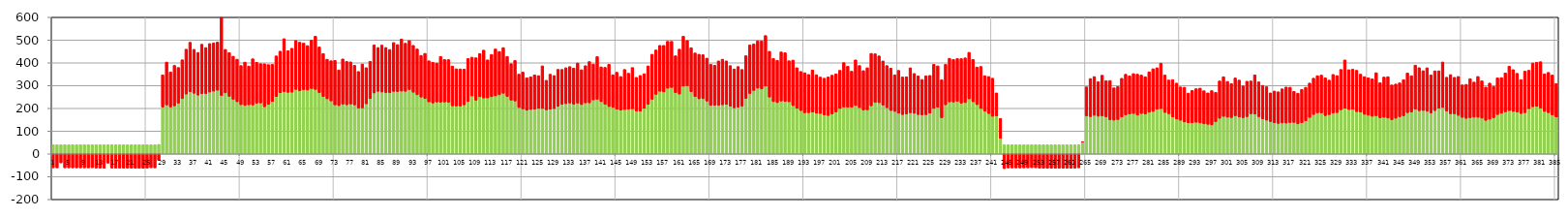
| Category | Технич потери | Коммерч |
|---|---|---|
| 0 | 40.177 | -61.424 |
| 1 | 40.177 | -61.596 |
| 2 | 40.177 | -39.695 |
| 3 | 40.177 | -61.449 |
| 4 | 40.177 | -61.481 |
| 5 | 40.177 | -61.507 |
| 6 | 40.177 | -61.566 |
| 7 | 40.177 | -61.611 |
| 8 | 40.177 | -61.558 |
| 9 | 40.177 | -61.572 |
| 10 | 40.177 | -60.806 |
| 11 | 40.177 | -62.215 |
| 12 | 40.177 | -62.842 |
| 13 | 40.177 | -62.888 |
| 14 | 40.177 | -40.828 |
| 15 | 40.177 | -62.418 |
| 16 | 40.177 | -62.504 |
| 17 | 40.177 | -62.665 |
| 18 | 40.177 | -62.781 |
| 19 | 40.177 | -62.767 |
| 20 | 40.177 | -62.87 |
| 21 | 40.177 | -63.203 |
| 22 | 40.177 | -63.323 |
| 23 | 40.177 | -63.776 |
| 24 | 40.177 | -62.591 |
| 25 | 40.177 | -60.986 |
| 26 | 40.177 | -61.434 |
| 27 | 41.552 | -28.352 |
| 28 | 205.271 | 141.677 |
| 29 | 214.719 | 188.447 |
| 30 | 205.045 | 154.985 |
| 31 | 210.693 | 177.776 |
| 32 | 222.275 | 157.188 |
| 33 | 243.038 | 170.319 |
| 34 | 262.456 | 197.323 |
| 35 | 272.575 | 217.698 |
| 36 | 266.02 | 193.243 |
| 37 | 257.903 | 187.428 |
| 38 | 264.232 | 217.415 |
| 39 | 264.53 | 202.36 |
| 40 | 271.336 | 213.285 |
| 41 | 275.358 | 212.043 |
| 42 | 279.392 | 211.878 |
| 43 | 256 | 1385.104 |
| 44 | 267.815 | 191.111 |
| 45 | 252.258 | 192.517 |
| 46 | 239.373 | 189.653 |
| 47 | 228.878 | 186.964 |
| 48 | 215.773 | 172.306 |
| 49 | 212.376 | 190.737 |
| 50 | 215.419 | 170.46 |
| 51 | 214.462 | 203.112 |
| 52 | 222.265 | 179.75 |
| 53 | 223.573 | 172.697 |
| 54 | 206.714 | 189.149 |
| 55 | 217.274 | 174.996 |
| 56 | 229.707 | 163.429 |
| 57 | 251.248 | 179.028 |
| 58 | 267.973 | 183.183 |
| 59 | 273.609 | 232.433 |
| 60 | 270.181 | 182.782 |
| 61 | 270.86 | 192.982 |
| 62 | 282.936 | 215.137 |
| 63 | 276.658 | 213.985 |
| 64 | 281.792 | 204.754 |
| 65 | 280.18 | 195.366 |
| 66 | 286.616 | 213.074 |
| 67 | 283.008 | 233.614 |
| 68 | 268.497 | 200.934 |
| 69 | 251.042 | 189.702 |
| 70 | 241.726 | 174.047 |
| 71 | 232.281 | 176.713 |
| 72 | 214.983 | 195.329 |
| 73 | 211.816 | 156.99 |
| 74 | 218.016 | 198.932 |
| 75 | 215.452 | 190.596 |
| 76 | 218.644 | 185.387 |
| 77 | 214.971 | 174.056 |
| 78 | 201.227 | 160.627 |
| 79 | 201.793 | 192.993 |
| 80 | 219.896 | 158.763 |
| 81 | 242.322 | 164.351 |
| 82 | 267.417 | 211.035 |
| 83 | 274.411 | 192.778 |
| 84 | 271.477 | 206.24 |
| 85 | 268.991 | 198.238 |
| 86 | 268.272 | 190.217 |
| 87 | 273.958 | 215.162 |
| 88 | 273.236 | 206.927 |
| 89 | 275.46 | 228.994 |
| 90 | 274.478 | 211.464 |
| 91 | 282.021 | 215.6 |
| 92 | 270.597 | 206.038 |
| 93 | 259.353 | 201.25 |
| 94 | 249.055 | 183.387 |
| 95 | 242.499 | 198.966 |
| 96 | 228.193 | 180.696 |
| 97 | 223.059 | 179.414 |
| 98 | 227.565 | 171.277 |
| 99 | 226.623 | 201.308 |
| 100 | 227.682 | 186.847 |
| 101 | 226.471 | 187.719 |
| 102 | 210.742 | 174.975 |
| 103 | 210.181 | 163.413 |
| 104 | 210.19 | 162.907 |
| 105 | 215.269 | 157.026 |
| 106 | 230.457 | 188.366 |
| 107 | 254.387 | 170.287 |
| 108 | 235.335 | 186.93 |
| 109 | 250.616 | 189.9 |
| 110 | 245.189 | 210.485 |
| 111 | 245.589 | 167.399 |
| 112 | 250.691 | 186.013 |
| 113 | 254.545 | 206.11 |
| 114 | 259.124 | 190.919 |
| 115 | 265.871 | 200.755 |
| 116 | 251.722 | 176.338 |
| 117 | 235.41 | 160.858 |
| 118 | 231.848 | 178.332 |
| 119 | 203.318 | 146.734 |
| 120 | 197.529 | 161.76 |
| 121 | 191.318 | 142.98 |
| 122 | 194.916 | 143.569 |
| 123 | 195.885 | 150.868 |
| 124 | 199.659 | 144.077 |
| 125 | 199.302 | 187.402 |
| 126 | 193.33 | 129.938 |
| 127 | 196.203 | 153.682 |
| 128 | 198.904 | 145.239 |
| 129 | 208.293 | 162.984 |
| 130 | 217.26 | 153.772 |
| 131 | 220.297 | 158.209 |
| 132 | 223.004 | 160.48 |
| 133 | 217.948 | 158.749 |
| 134 | 222.718 | 176.424 |
| 135 | 216.497 | 153.111 |
| 136 | 223.734 | 163.758 |
| 137 | 223.808 | 181.627 |
| 138 | 236.686 | 157.965 |
| 139 | 239.41 | 187.684 |
| 140 | 229.096 | 153 |
| 141 | 217.101 | 162.78 |
| 142 | 207.521 | 185.976 |
| 143 | 203.74 | 143.782 |
| 144 | 196.059 | 162.334 |
| 145 | 191.955 | 147.921 |
| 146 | 194.743 | 176.038 |
| 147 | 196.501 | 157.651 |
| 148 | 197.936 | 181.266 |
| 149 | 188.025 | 148.104 |
| 150 | 187.526 | 157.063 |
| 151 | 199.892 | 152.186 |
| 152 | 217.379 | 169 |
| 153 | 239.629 | 197.954 |
| 154 | 261.201 | 195.06 |
| 155 | 274.672 | 201.9 |
| 156 | 271.952 | 204.642 |
| 157 | 288.127 | 206.317 |
| 158 | 291.414 | 202.869 |
| 159 | 268.385 | 162.55 |
| 160 | 262.452 | 197.494 |
| 161 | 297.085 | 219.561 |
| 162 | 298.922 | 198.964 |
| 163 | 272.619 | 193.546 |
| 164 | 251.425 | 191.776 |
| 165 | 241.728 | 195.924 |
| 166 | 242.189 | 193.437 |
| 167 | 231.651 | 189.054 |
| 168 | 212.938 | 180.449 |
| 169 | 213.009 | 176.369 |
| 170 | 213.454 | 194.861 |
| 171 | 215.669 | 200.206 |
| 172 | 216.983 | 191.477 |
| 173 | 209.16 | 178.609 |
| 174 | 202.17 | 170.634 |
| 175 | 204.638 | 178.903 |
| 176 | 209.456 | 161.415 |
| 177 | 243.118 | 188.083 |
| 178 | 264.739 | 213.809 |
| 179 | 278.194 | 204.525 |
| 180 | 288.552 | 207.909 |
| 181 | 284.839 | 210.867 |
| 182 | 297.494 | 222.246 |
| 183 | 249.131 | 201.423 |
| 184 | 229.225 | 189.896 |
| 185 | 224.918 | 185.833 |
| 186 | 231.97 | 215.651 |
| 187 | 229.986 | 214.144 |
| 188 | 228.597 | 180.453 |
| 189 | 211.831 | 200.148 |
| 190 | 199.817 | 178.675 |
| 191 | 190.132 | 171.868 |
| 192 | 180.229 | 176.005 |
| 193 | 180.698 | 168.17 |
| 194 | 183.208 | 185.235 |
| 195 | 178.266 | 169.486 |
| 196 | 177.389 | 159.845 |
| 197 | 170.606 | 161.752 |
| 198 | 168.502 | 169.189 |
| 199 | 175.181 | 170.493 |
| 200 | 183.484 | 167.891 |
| 201 | 199.262 | 167.8 |
| 202 | 205.481 | 195.34 |
| 203 | 204.235 | 180.594 |
| 204 | 204.608 | 158.654 |
| 205 | 212.205 | 200.571 |
| 206 | 202.663 | 185.424 |
| 207 | 192.257 | 173.458 |
| 208 | 192.781 | 185.444 |
| 209 | 210.923 | 230.48 |
| 210 | 225.598 | 214.072 |
| 211 | 224.559 | 205.8 |
| 212 | 213.847 | 194.303 |
| 213 | 202.666 | 185.257 |
| 214 | 190.257 | 186.178 |
| 215 | 186.406 | 160.742 |
| 216 | 178.314 | 188.452 |
| 217 | 172.563 | 165.162 |
| 218 | 175.291 | 163.347 |
| 219 | 180.234 | 197.731 |
| 220 | 178.181 | 174.947 |
| 221 | 172.492 | 169.777 |
| 222 | 170.692 | 156.109 |
| 223 | 171.8 | 171.195 |
| 224 | 178.664 | 165.993 |
| 225 | 199.559 | 194.056 |
| 226 | 204.207 | 182.287 |
| 227 | 158.486 | 166.728 |
| 228 | 215.681 | 177.567 |
| 229 | 227.993 | 191.715 |
| 230 | 227.276 | 187.257 |
| 231 | 230.462 | 188.095 |
| 232 | 222.368 | 196.009 |
| 233 | 225.121 | 196.555 |
| 234 | 241.569 | 204.41 |
| 235 | 228.899 | 185.808 |
| 236 | 216.29 | 164.874 |
| 237 | 199.35 | 184.575 |
| 238 | 187.544 | 155.931 |
| 239 | 177.001 | 162.844 |
| 240 | 164.916 | 167.371 |
| 241 | 166.889 | 100.749 |
| 242 | 68.636 | 87.201 |
| 243 | 40.177 | -64.793 |
| 244 | 40.177 | -61.876 |
| 245 | 40.177 | -61.937 |
| 246 | 40.177 | -61.965 |
| 247 | 40.177 | -62.007 |
| 248 | 40.177 | -61.83 |
| 249 | 40.177 | -61.488 |
| 250 | 40.177 | -60.71 |
| 251 | 40.177 | -61.076 |
| 252 | 40.177 | -62.853 |
| 253 | 40.177 | -63.239 |
| 254 | 40.177 | -63.45 |
| 255 | 40.177 | -63.263 |
| 256 | 40.177 | -63.313 |
| 257 | 40.177 | -63.298 |
| 258 | 40.177 | -63.275 |
| 259 | 40.177 | -63.238 |
| 260 | 40.177 | -63.483 |
| 261 | 40.177 | -62.879 |
| 262 | 40.177 | -61.276 |
| 263 | 51.686 | 1.413 |
| 264 | 166.816 | 127.632 |
| 265 | 163.288 | 167.475 |
| 266 | 169.146 | 170.408 |
| 267 | 165.141 | 152.185 |
| 268 | 166.377 | 179.079 |
| 269 | 162.111 | 159.601 |
| 270 | 149.363 | 172.908 |
| 271 | 147.962 | 142.185 |
| 272 | 150.355 | 145.565 |
| 273 | 161.63 | 170.417 |
| 274 | 170.678 | 179.05 |
| 275 | 174.883 | 167.818 |
| 276 | 177.146 | 175.496 |
| 277 | 169.997 | 179.994 |
| 278 | 177.249 | 168.895 |
| 279 | 174.945 | 163.838 |
| 280 | 182.628 | 177.844 |
| 281 | 186.332 | 187.405 |
| 282 | 196.095 | 182.185 |
| 283 | 198.731 | 199.607 |
| 284 | 181.796 | 164.492 |
| 285 | 176.206 | 148.164 |
| 286 | 161.719 | 164.351 |
| 287 | 152.959 | 157.908 |
| 288 | 147.597 | 146.618 |
| 289 | 140.074 | 152.783 |
| 290 | 136.026 | 130.636 |
| 291 | 136.161 | 142.323 |
| 292 | 138.686 | 147.643 |
| 293 | 135.734 | 153.141 |
| 294 | 131.586 | 145.838 |
| 295 | 129.737 | 137.998 |
| 296 | 127.107 | 150.596 |
| 297 | 140.969 | 129.553 |
| 298 | 155.993 | 164.215 |
| 299 | 164.487 | 174.331 |
| 300 | 160.855 | 157.491 |
| 301 | 159.05 | 149.705 |
| 302 | 166.895 | 166.389 |
| 303 | 161.749 | 162.301 |
| 304 | 158.555 | 139.943 |
| 305 | 163.133 | 156.043 |
| 306 | 175.925 | 144.333 |
| 307 | 174.474 | 172.398 |
| 308 | 163.175 | 153.17 |
| 309 | 153.417 | 147.45 |
| 310 | 147.892 | 147.218 |
| 311 | 141.602 | 126.243 |
| 312 | 136.484 | 139.544 |
| 313 | 133.641 | 139.103 |
| 314 | 135.485 | 150.289 |
| 315 | 135.091 | 158.658 |
| 316 | 137.134 | 155.775 |
| 317 | 137.672 | 136.736 |
| 318 | 131.729 | 134.611 |
| 319 | 136.391 | 146.637 |
| 320 | 144.874 | 147.637 |
| 321 | 159.989 | 150.967 |
| 322 | 172.645 | 159.759 |
| 323 | 180.084 | 163.257 |
| 324 | 179.694 | 166.137 |
| 325 | 167.89 | 165.942 |
| 326 | 172.434 | 151.557 |
| 327 | 179.294 | 169.722 |
| 328 | 181.129 | 162.772 |
| 329 | 193.637 | 177.226 |
| 330 | 200.362 | 212.106 |
| 331 | 194.76 | 175 |
| 332 | 196.203 | 175.654 |
| 333 | 185.366 | 181.738 |
| 334 | 183.86 | 166.227 |
| 335 | 173.56 | 165.973 |
| 336 | 169.566 | 164.529 |
| 337 | 164.959 | 164.463 |
| 338 | 167.211 | 189.239 |
| 339 | 158.028 | 154.479 |
| 340 | 160.574 | 176.801 |
| 341 | 156.998 | 182.056 |
| 342 | 149.636 | 153.25 |
| 343 | 156.191 | 150.396 |
| 344 | 162.916 | 148.805 |
| 345 | 167.006 | 158.957 |
| 346 | 180.597 | 174.628 |
| 347 | 183.255 | 160.272 |
| 348 | 196.643 | 193.111 |
| 349 | 189.133 | 189.497 |
| 350 | 190.441 | 174.883 |
| 351 | 186.977 | 191.208 |
| 352 | 179.33 | 167.4 |
| 353 | 190.089 | 174.55 |
| 354 | 200.425 | 164.395 |
| 355 | 203.532 | 200.057 |
| 356 | 188.017 | 148.602 |
| 357 | 175.83 | 172.431 |
| 358 | 175.673 | 160.623 |
| 359 | 168.802 | 171.195 |
| 360 | 160.103 | 143.145 |
| 361 | 155.889 | 149.517 |
| 362 | 158.412 | 171.806 |
| 363 | 160.899 | 154.469 |
| 364 | 160.535 | 179.473 |
| 365 | 156.626 | 163.99 |
| 366 | 146.995 | 146.43 |
| 367 | 152.016 | 158.934 |
| 368 | 158.584 | 137.95 |
| 369 | 172.624 | 161.14 |
| 370 | 178.12 | 156.848 |
| 371 | 184.484 | 170.996 |
| 372 | 190.116 | 194.885 |
| 373 | 186.39 | 183.795 |
| 374 | 183.798 | 170.11 |
| 375 | 177.217 | 148.914 |
| 376 | 180.819 | 182.519 |
| 377 | 198.51 | 168.831 |
| 378 | 207.041 | 192.022 |
| 379 | 208.52 | 193.794 |
| 380 | 201.244 | 203.649 |
| 381 | 186.336 | 165.106 |
| 382 | 180.905 | 177.028 |
| 383 | 170.393 | 175.874 |
| 384 | 161.977 | 146.769 |